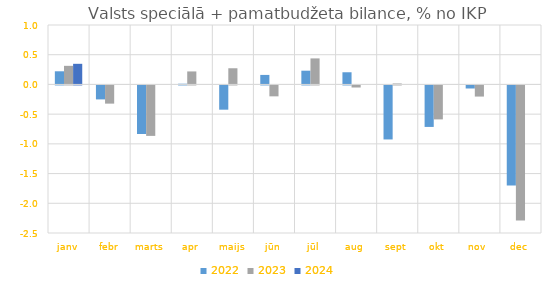
| Category | 2022 | 2023 | 2024 |
|---|---|---|---|
| janv | 0.221 | 0.313 | 0.347 |
| febr | -0.235 | -0.306 | 0 |
| marts | -0.817 | -0.849 | 0 |
| apr | 0.011 | 0.219 | 0 |
| maijs | -0.408 | 0.272 | 0 |
| jūn | 0.16 | -0.184 | 0 |
| jūl | 0.231 | 0.438 | 0 |
| aug | 0.205 | -0.035 | 0 |
| sept | -0.909 | 0.016 | 0 |
| okt | -0.698 | -0.572 | 0 |
| nov | -0.051 | -0.188 | 0 |
| dec | -1.686 | -2.272 | 0 |